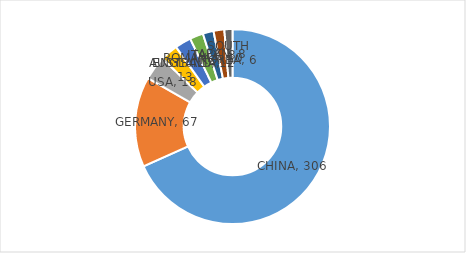
| Category | Series 0 |
|---|---|
| CHINA | 306 |
| GERMANY | 67 |
| USA | 18 |
| AUSTRALIA | 13 |
| ENGLAND | 12 |
| ROMANIA | 10 |
| ITALY | 8 |
| JAPAN | 8 |
| SOUTH KOREA | 6 |